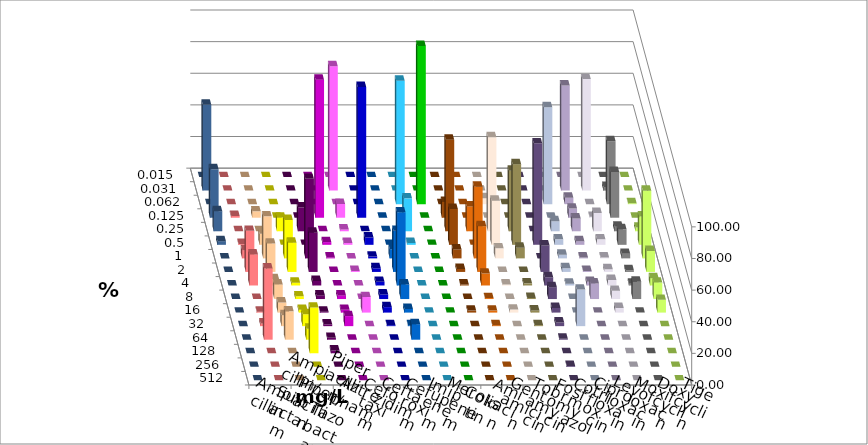
| Category | Ampicillin | Ampicillin/ Sulbactam | Piperacillin | Piperacillin/ Tazobactam | Aztreonam | Cefotaxim | Ceftazidim | Cefuroxim | Imipenem | Meropenem | Colistin | Amikacin | Gentamicin | Tobramycin | Fosfomycin | Cotrimoxazol | Ciprofloxacin | Levofloxacin | Moxifloxacin | Doxycyclin | Tigecyclin |
|---|---|---|---|---|---|---|---|---|---|---|---|---|---|---|---|---|---|---|---|---|---|
| 0.015 | 0 | 0 | 0 | 0 | 0 | 0 | 0 | 0 | 0 | 0 | 0 | 0 | 0 | 0 | 0 | 0 | 0 | 0 | 0 | 0 | 0 |
| 0.031 | 0 | 0 | 0 | 0 | 0 | 78.613 | 0 | 0 | 0 | 0 | 0 | 0 | 0 | 0 | 0 | 0 | 66.474 | 70.52 | 2.312 | 0 | 54.335 |
| 0.062 | 0 | 0 | 0 | 0 | 0 | 0 | 0 | 0 | 78.035 | 100 | 0 | 0 | 3.797 | 0 | 0 | 61.272 | 4.046 | 0 | 39.884 | 0.578 | 0 |
| 0.125 | 1.156 | 4.046 | 0 | 0 | 87.283 | 8.671 | 82.659 | 0 | 0 | 0 | 10.063 | 0 | 0 | 0 | 0 | 0 | 5.78 | 0.578 | 28.902 | 0 | 30.636 |
| 0.25 | 0 | 0 | 8.671 | 15.029 | 0 | 1.156 | 0 | 0 | 20.809 | 0 | 57.862 | 15.723 | 59.494 | 38.255 | 0 | 6.358 | 8.092 | 11.561 | 2.89 | 2.312 | 12.717 |
| 0.5 | 0.578 | 6.936 | 0 | 0 | 1.734 | 1.156 | 4.624 | 0 | 1.156 | 0 | 22.642 | 0 | 27.848 | 51.007 | 64.162 | 3.468 | 2.312 | 3.468 | 9.827 | 17.919 | 2.312 |
| 1.0 | 5.202 | 26.59 | 24.277 | 50.289 | 0.578 | 0 | 1.156 | 5.78 | 0 | 0 | 5.66 | 45.283 | 6.329 | 6.711 | 0 | 2.312 | 0.578 | 0.578 | 2.89 | 42.775 | 0 |
| 2.0 | 26.012 | 17.919 | 18.497 | 24.855 | 0 | 0.578 | 2.312 | 26.012 | 0 | 0 | 1.887 | 28.931 | 0 | 0 | 16.763 | 2.312 | 0.578 | 1.734 | 1.156 | 13.295 | 0 |
| 4.0 | 19.653 | 4.046 | 1.734 | 2.89 | 0 | 0 | 2.312 | 46.243 | 0 | 0 | 0.629 | 7.547 | 0.633 | 1.342 | 5.202 | 1.156 | 2.312 | 3.468 | 1.156 | 4.624 | 0 |
| 8.0 | 0 | 9.249 | 1.734 | 2.312 | 2.312 | 0 | 2.89 | 9.249 | 0 | 0 | 0 | 0.629 | 0 | 0.671 | 7.514 | 0 | 9.827 | 5.202 | 10.983 | 10.405 | 0 |
| 16.0 | 0.578 | 6.358 | 1.734 | 0.578 | 1.734 | 9.827 | 3.468 | 2.312 | 0 | 0 | 1.258 | 1.258 | 1.899 | 1.342 | 2.89 | 0 | 0 | 2.89 | 0 | 8.092 | 0 |
| 32.0 | 1.734 | 6.936 | 7.514 | 1.156 | 6.358 | 0 | 0.578 | 0.578 | 0 | 0 | 0 | 0.629 | 0 | 0.671 | 2.312 | 23.121 | 0 | 0 | 0 | 0 | 0 |
| 64.0 | 45.087 | 17.919 | 6.936 | 1.156 | 0 | 0 | 0 | 9.827 | 0 | 0 | 0 | 0 | 0 | 0 | 0.578 | 0 | 0 | 0 | 0 | 0 | 0 |
| 128.0 | 0 | 0 | 28.902 | 1.734 | 0 | 0 | 0 | 0 | 0 | 0 | 0 | 0 | 0 | 0 | 0 | 0 | 0 | 0 | 0 | 0 | 0 |
| 256.0 | 0 | 0 | 0 | 0 | 0 | 0 | 0 | 0 | 0 | 0 | 0 | 0 | 0 | 0 | 0.578 | 0 | 0 | 0 | 0 | 0 | 0 |
| 512.0 | 0 | 0 | 0 | 0 | 0 | 0 | 0 | 0 | 0 | 0 | 0 | 0 | 0 | 0 | 0 | 0 | 0 | 0 | 0 | 0 | 0 |